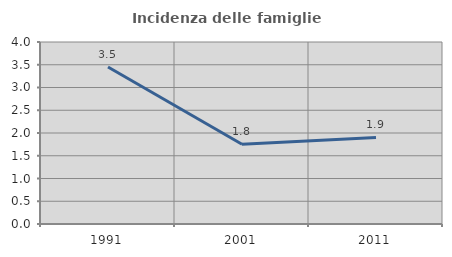
| Category | Incidenza delle famiglie numerose |
|---|---|
| 1991.0 | 3.451 |
| 2001.0 | 1.754 |
| 2011.0 | 1.901 |